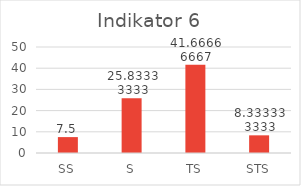
| Category | Series 0 |
|---|---|
| 0 | 7.5 |
| 1 | 25.833 |
| 2 | 41.667 |
| 3 | 8.333 |